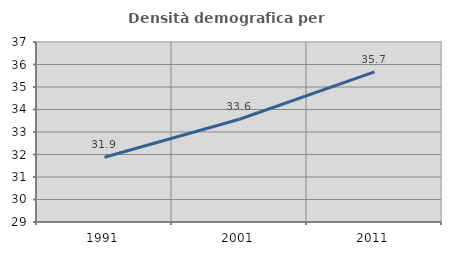
| Category | Densità demografica |
|---|---|
| 1991.0 | 31.88 |
| 2001.0 | 33.568 |
| 2011.0 | 35.672 |